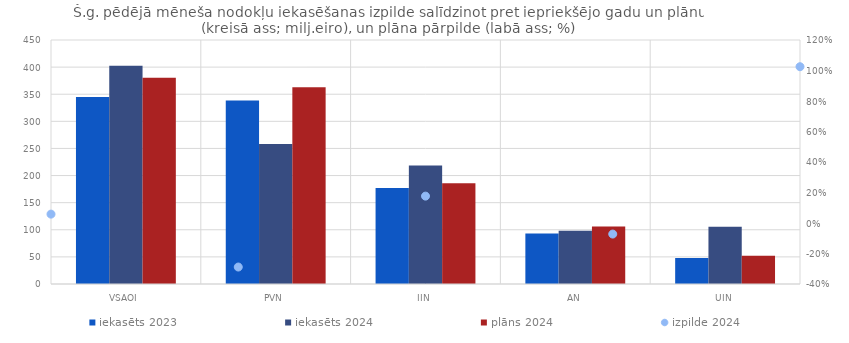
| Category | iekasēts 2023 | iekasēts 2024 | plāns 2024 |
|---|---|---|---|
| VSAOI | 344.906 | 402.61 | 380.469 |
| PVN | 338.499 | 257.977 | 362.7 |
| IIN | 176.948 | 218.77 | 186 |
| AN | 93.144 | 98.179 | 105.86 |
| UIN | 47.876 | 105.696 | 52.2 |